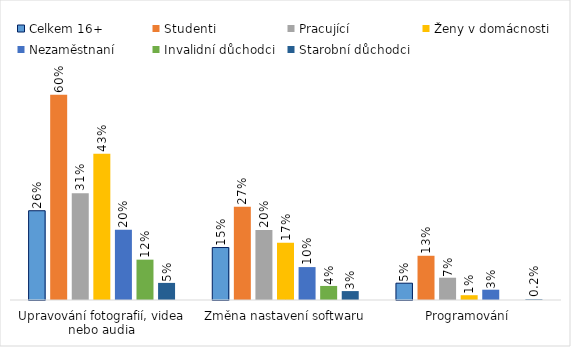
| Category | Celkem 16+ | Studenti | Pracující | Ženy v domácnosti | Nezaměstnaní | Invalidní důchodci | Starobní důchodci |
|---|---|---|---|---|---|---|---|
| Upravování fotografií, videa nebo audia | 0.26 | 0.599 | 0.311 | 0.427 | 0.205 | 0.118 | 0.05 |
| Změna nastavení softwaru | 0.153 | 0.272 | 0.204 | 0.167 | 0.096 | 0.041 | 0.026 |
| Programování | 0.049 | 0.129 | 0.065 | 0.014 | 0.03 | 0 | 0.002 |